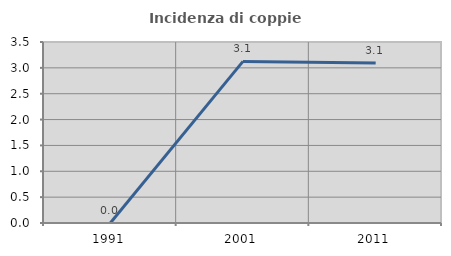
| Category | Incidenza di coppie miste |
|---|---|
| 1991.0 | 0 |
| 2001.0 | 3.125 |
| 2011.0 | 3.093 |